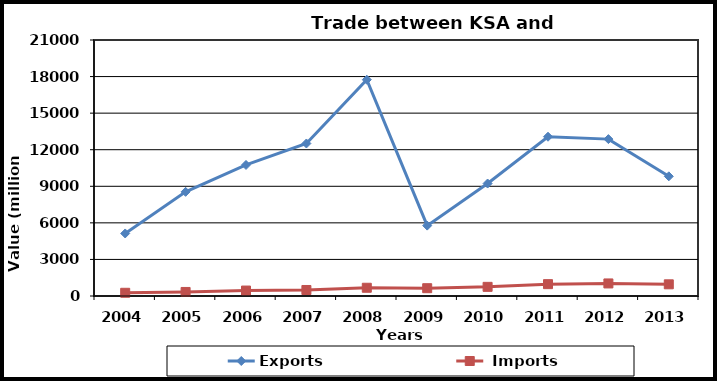
| Category | Exports |  Imports |
|---|---|---|
| 2004.0 | 5130 | 263 |
| 2005.0 | 8544 | 331 |
| 2006.0 | 10751 | 447 |
| 2007.0 | 12510 | 493 |
| 2008.0 | 17742 | 676 |
| 2009.0 | 5773 | 640 |
| 2010.0 | 9226 | 750 |
| 2011.0 | 13064 | 972 |
| 2012.0 | 12870 | 1030 |
| 2013.0 | 9818 | 958 |